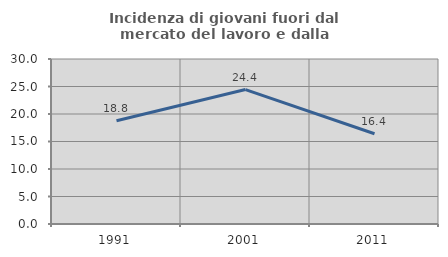
| Category | Incidenza di giovani fuori dal mercato del lavoro e dalla formazione  |
|---|---|
| 1991.0 | 18.768 |
| 2001.0 | 24.444 |
| 2011.0 | 16.413 |